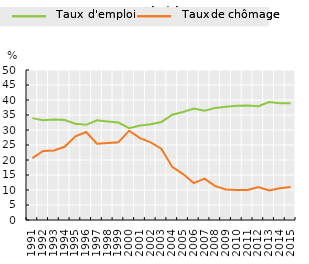
| Category | Taux d'emploi | Taux de chômage |
|---|---|---|
| 1991.0 | 33.956 | 20.6 |
| 1992.0 | 33.264 | 23 |
| 1993.0 | 33.504 | 23.2 |
| 1994.0 | 33.302 | 24.4 |
| 1995.0 | 32.071 | 27.9 |
| 1996.0 | 31.73 | 29.342 |
| 1997.0 | 33.213 | 25.43 |
| 1998.0 | 32.843 | 25.675 |
| 1999.0 | 32.482 | 25.938 |
| 2000.0 | 30.586 | 29.77 |
| 2001.0 | 31.467 | 27.3 |
| 2002.0 | 31.896 | 25.9 |
| 2003.0 | 32.683 | 23.7 |
| 2004.0 | 35.101 | 17.7 |
| 2005.0 | 35.99 | 15.3 |
| 2006.0 | 37.142 | 12.3 |
| 2007.0 | 36.401 | 13.8 |
| 2008.0 | 37.365 | 11.3 |
| 2009.0 | 37.775 | 10.16 |
| 2010.0 | 38.068 | 9.96 |
| 2011.0 | 38.174 | 10 |
| 2012.0 | 37.914 | 10.97 |
| 2013.0 | 39.302 | 9.82 |
| 2014.0 | 38.946 | 10.6 |
| 2015.0 | 38.888 | 11.001 |